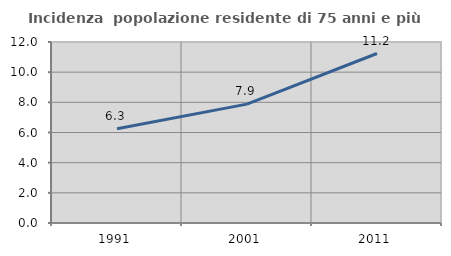
| Category | Incidenza  popolazione residente di 75 anni e più |
|---|---|
| 1991.0 | 6.254 |
| 2001.0 | 7.88 |
| 2011.0 | 11.237 |